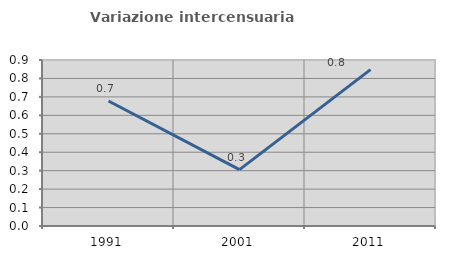
| Category | Variazione intercensuaria annua |
|---|---|
| 1991.0 | 0.678 |
| 2001.0 | 0.306 |
| 2011.0 | 0.848 |